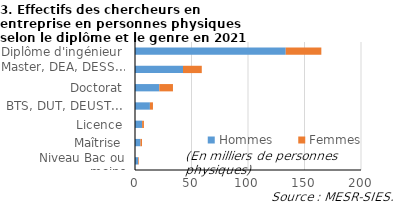
| Category | Hommes | Femmes |
|---|---|---|
| Niveau Bac ou moins | 2.8 | 0.6 |
| Maîtrise | 4.8 | 1.4 |
| Licence | 6.3 | 1.6 |
| BTS, DUT, DEUST... | 13.2 | 2.7 |
| Doctorat | 21.5 | 12.1 |
| Master, DEA, DESS... | 42.5 | 16.6 |
| Diplôme d'ingénieur | 133.4 | 31.5 |